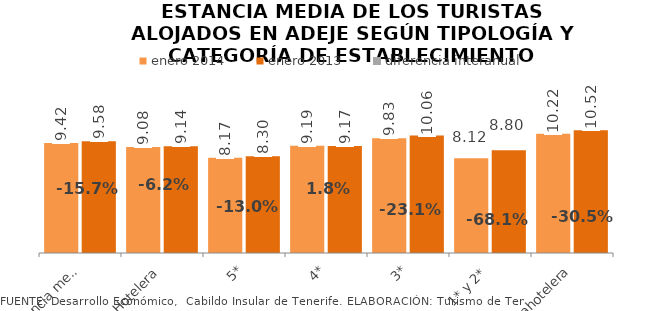
| Category | enero 2014 | enero 2013 |
|---|---|---|
| Estancia media total | 9.42 | 9.577 |
| Hotelera | 9.08 | 9.142 |
| 5* | 8.17 | 8.3 |
| 4* | 9.19 | 9.172 |
| 3* | 9.83 | 10.061 |
| 1* y 2* | 8.115 | 8.797 |
| Extrahotelera | 10.22 | 10.525 |